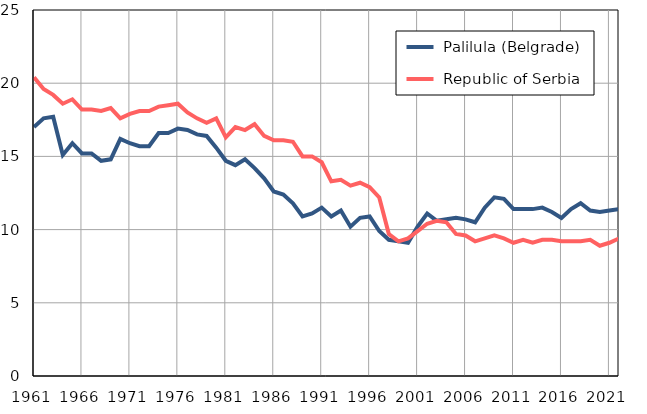
| Category |  Palilula (Belgrade) |  Republic of Serbia |
|---|---|---|
| 1961.0 | 17 | 20.4 |
| 1962.0 | 17.6 | 19.6 |
| 1963.0 | 17.7 | 19.2 |
| 1964.0 | 15.1 | 18.6 |
| 1965.0 | 15.9 | 18.9 |
| 1966.0 | 15.2 | 18.2 |
| 1967.0 | 15.2 | 18.2 |
| 1968.0 | 14.7 | 18.1 |
| 1969.0 | 14.8 | 18.3 |
| 1970.0 | 16.2 | 17.6 |
| 1971.0 | 15.9 | 17.9 |
| 1972.0 | 15.7 | 18.1 |
| 1973.0 | 15.7 | 18.1 |
| 1974.0 | 16.6 | 18.4 |
| 1975.0 | 16.6 | 18.5 |
| 1976.0 | 16.9 | 18.6 |
| 1977.0 | 16.8 | 18 |
| 1978.0 | 16.5 | 17.6 |
| 1979.0 | 16.4 | 17.3 |
| 1980.0 | 15.6 | 17.6 |
| 1981.0 | 14.7 | 16.3 |
| 1982.0 | 14.4 | 17 |
| 1983.0 | 14.8 | 16.8 |
| 1984.0 | 14.2 | 17.2 |
| 1985.0 | 13.5 | 16.4 |
| 1986.0 | 12.6 | 16.1 |
| 1987.0 | 12.4 | 16.1 |
| 1988.0 | 11.8 | 16 |
| 1989.0 | 10.9 | 15 |
| 1990.0 | 11.1 | 15 |
| 1991.0 | 11.5 | 14.6 |
| 1992.0 | 10.9 | 13.3 |
| 1993.0 | 11.3 | 13.4 |
| 1994.0 | 10.2 | 13 |
| 1995.0 | 10.8 | 13.2 |
| 1996.0 | 10.9 | 12.9 |
| 1997.0 | 9.9 | 12.2 |
| 1998.0 | 9.3 | 9.7 |
| 1999.0 | 9.2 | 9.2 |
| 2000.0 | 9.1 | 9.4 |
| 2001.0 | 10.2 | 9.9 |
| 2002.0 | 11.1 | 10.4 |
| 2003.0 | 10.6 | 10.6 |
| 2004.0 | 10.7 | 10.5 |
| 2005.0 | 10.8 | 9.7 |
| 2006.0 | 10.7 | 9.6 |
| 2007.0 | 10.5 | 9.2 |
| 2008.0 | 11.5 | 9.4 |
| 2009.0 | 12.2 | 9.6 |
| 2010.0 | 12.1 | 9.4 |
| 2011.0 | 11.4 | 9.1 |
| 2012.0 | 11.4 | 9.3 |
| 2013.0 | 11.4 | 9.1 |
| 2014.0 | 11.5 | 9.3 |
| 2015.0 | 11.2 | 9.3 |
| 2016.0 | 10.8 | 9.2 |
| 2017.0 | 11.4 | 9.2 |
| 2018.0 | 11.8 | 9.2 |
| 2019.0 | 11.3 | 9.3 |
| 2020.0 | 11.2 | 8.9 |
| 2021.0 | 11.3 | 9.1 |
| 2022.0 | 11.4 | 9.4 |